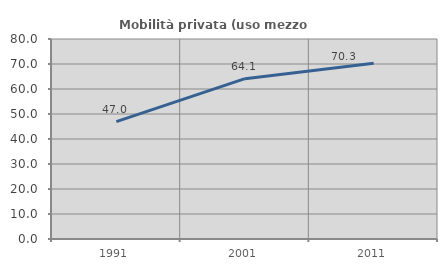
| Category | Mobilità privata (uso mezzo privato) |
|---|---|
| 1991.0 | 46.957 |
| 2001.0 | 64.141 |
| 2011.0 | 70.309 |